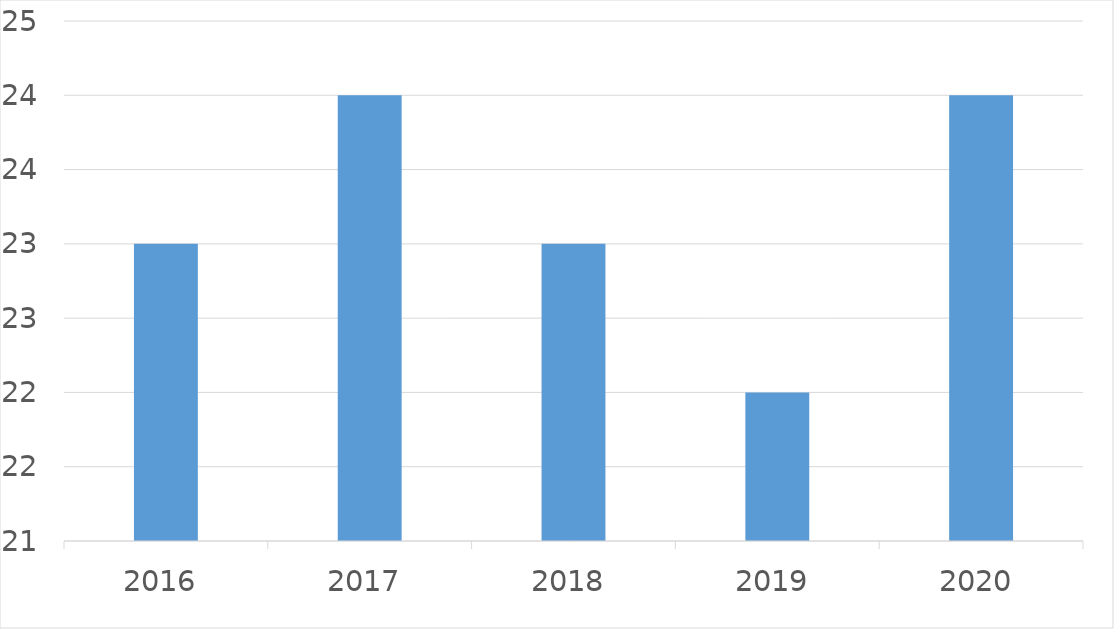
| Category | Series 0 |
|---|---|
| 2016 | 23 |
| 2017 | 24 |
| 2018 | 23 |
| 2019 | 22 |
| 2020 | 24 |